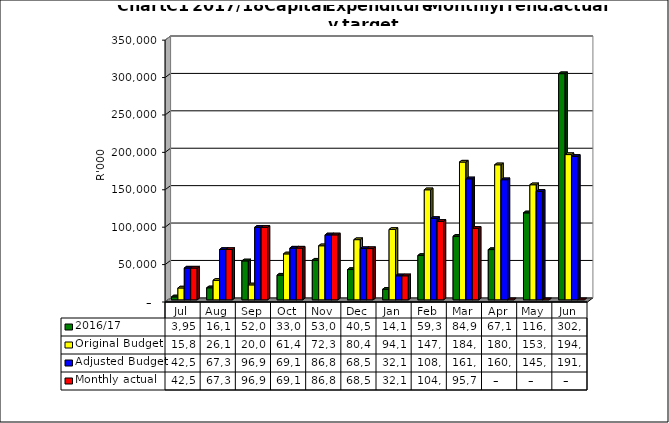
| Category | 2016/17 | Original Budget | Adjusted Budget | Monthly actual |
|---|---|---|---|---|
| Jul | 3958013.321 | 15888227.121 | 42514077.958 | 42514077.958 |
| Aug | 16119878.958 | 26147045.201 | 67305085.712 | 67305085.712 |
| Sep | 52071773.847 | 20000000 | 96927101.019 | 96927101.019 |
| Oct | 33023091.668 | 61424090.403 | 69191121.856 | 69191121.856 |
| Nov | 53074277.766 | 72300520.141 | 86835890.219 | 86835890.219 |
| Dec | 40503251.183 | 80450520.141 | 68525464.005 | 68525464.005 |
| Jan | 14140244.7 | 94117062.52 | 32153725.45 | 32153725.45 |
| Feb | 59318767.097 | 147118047.537 | 108760288.608 | 104925263.235 |
| Mar | 84955280.367 | 184167062.52 | 161756536.771 | 95751647.049 |
| Apr | 67166855.65 | 180519809.357 | 160571171.21 | 0 |
| May | 116269357.366 | 153826239.095 | 145082000 | 0 |
| Jun | 302312762.406 | 194159375.962 | 191756536.771 | 0 |